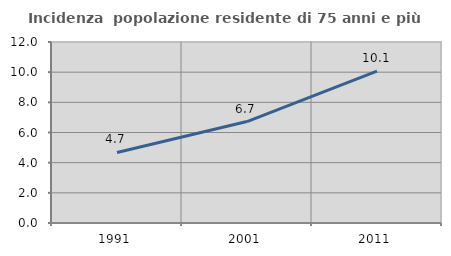
| Category | Incidenza  popolazione residente di 75 anni e più |
|---|---|
| 1991.0 | 4.678 |
| 2001.0 | 6.726 |
| 2011.0 | 10.066 |